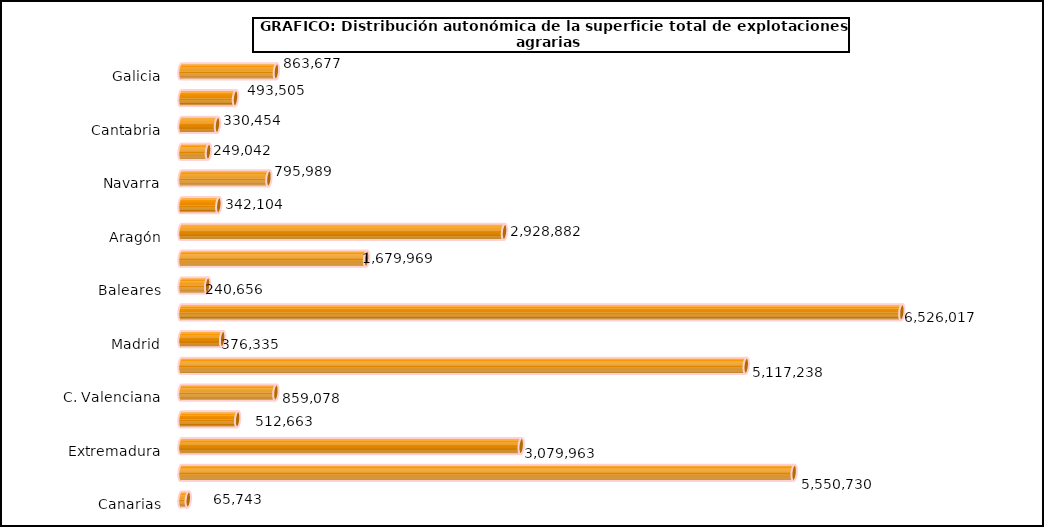
| Category | superficie |
|---|---|
|   Galicia | 863677 |
|   P. de Asturias | 493505 |
|   Cantabria | 330454 |
|   País Vasco | 249042 |
|   Navarra | 795989 |
|   La Rioja | 342104 |
|   Aragón | 2928882 |
|   Cataluña | 1679969 |
|   Baleares | 240656 |
|   Castilla y León | 6526017 |
|   Madrid | 376335 |
|   Castilla-La Mancha | 5117238 |
|   C. Valenciana | 859078 |
|   R. de Murcia | 512663 |
|   Extremadura | 3079963 |
|   Andalucía | 5550730 |
|   Canarias | 65743 |